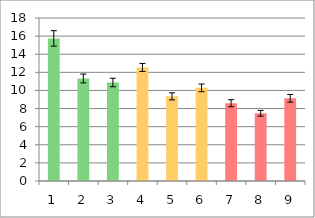
| Category | Series 0 |
|---|---|
| 0 | 15.744 |
| 1 | 11.32 |
| 2 | 10.88 |
| 3 | 12.54 |
| 4 | 9.347 |
| 5 | 10.286 |
| 6 | 8.588 |
| 7 | 7.479 |
| 8 | 9.13 |